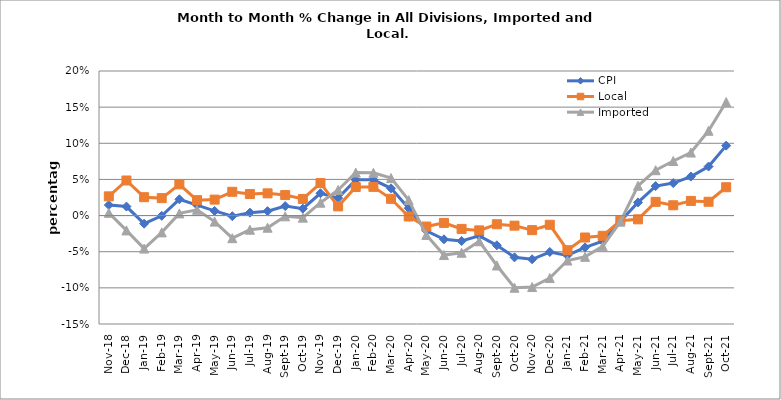
| Category | CPI | Local | Imported |
|---|---|---|---|
| 2018-11-01 | 0.015 | 0.027 | 0.004 |
| 2018-12-01 | 0.012 | 0.049 | -0.021 |
| 2019-01-01 | -0.011 | 0.025 | -0.046 |
| 2019-02-01 | 0 | 0.024 | -0.023 |
| 2019-03-01 | 0.023 | 0.043 | 0.003 |
| 2019-04-01 | 0.015 | 0.021 | 0.008 |
| 2019-05-01 | 0.006 | 0.022 | -0.008 |
| 2019-06-01 | -0.001 | 0.033 | -0.031 |
| 2019-07-01 | 0.004 | 0.03 | -0.02 |
| 2019-08-01 | 0.006 | 0.031 | -0.017 |
| 2019-09-01 | 0.013 | 0.028 | -0.001 |
| 2019-10-01 | 0.01 | 0.023 | -0.003 |
| 2019-11-01 | 0.031 | 0.045 | 0.018 |
| 2019-12-01 | 0.024 | 0.013 | 0.035 |
| 2020-01-01 | 0.049 | 0.039 | 0.059 |
| 2020-02-01 | 0.05 | 0.04 | 0.059 |
| 2020-03-01 | 0.038 | 0.023 | 0.052 |
| 2020-04-01 | 0.01 | -0.001 | 0.021 |
| 2020-05-01 | -0.021 | -0.015 | -0.027 |
| 2020-06-01 | -0.033 | -0.01 | -0.055 |
| 2020-07-01 | -0.035 | -0.018 | -0.051 |
| 2020-08-01 | -0.028 | -0.02 | -0.036 |
| 2020-09-01 | -0.041 | -0.012 | -0.069 |
| 2020-10-01 | -0.058 | -0.014 | -0.1 |
| 2020-11-01 | -0.06 | -0.02 | -0.099 |
| 2020-12-01 | -0.05 | -0.013 | -0.086 |
| 2021-01-01 | -0.055 | -0.048 | -0.062 |
| 2021-02-01 | -0.044 | -0.03 | -0.057 |
| 2021-03-01 | -0.035 | -0.028 | -0.043 |
| 2021-04-01 | -0.008 | -0.007 | -0.008 |
| 2021-05-01 | 0.018 | -0.005 | 0.041 |
| 2021-06-01 | 0.041 | 0.019 | 0.063 |
| 2021-07-01 | 0.045 | 0.014 | 0.075 |
| 2021-08-01 | 0.054 | 0.02 | 0.087 |
| 2021-09-01 | 0.068 | 0.019 | 0.117 |
| 2021-10-01 | 0.097 | 0.039 | 0.157 |